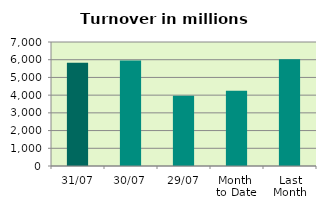
| Category | Series 0 |
|---|---|
| 31/07 | 5824.284 |
| 30/07 | 5953.172 |
| 29/07 | 3958.875 |
| Month 
to Date | 4246.231 |
| Last
Month | 6026.775 |